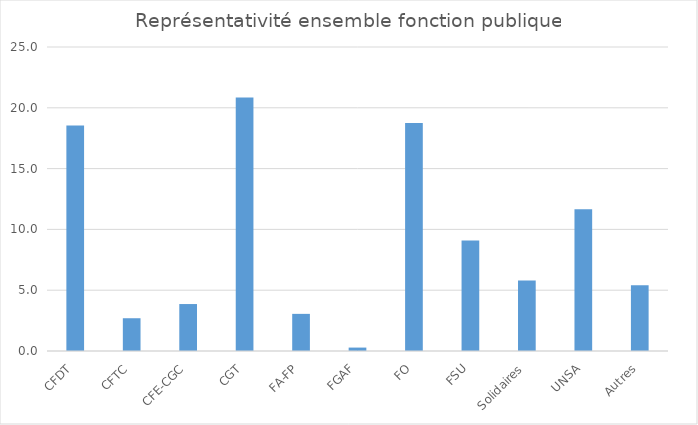
| Category | Series 0 |
|---|---|
| CFDT | 18.553 |
| CFTC | 2.695 |
| CFE-CGC | 3.862 |
| CGT | 20.856 |
| FA-FP | 3.054 |
| FGAF | 0.281 |
| FO | 18.746 |
| FSU | 9.092 |
| Solidaires | 5.793 |
| UNSA | 11.656 |
| Autres | 5.413 |